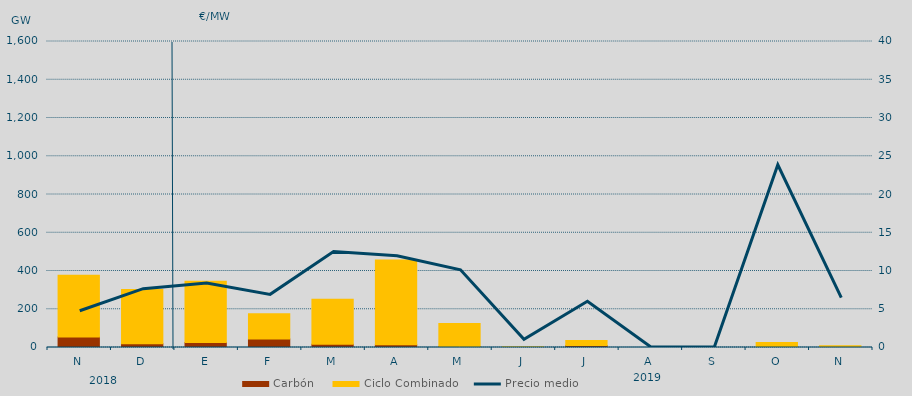
| Category | Carbón | Ciclo Combinado |
|---|---|---|
| N | 55331.6 | 322094.1 |
| D | 19590.2 | 283346.4 |
| E | 26403.5 | 320317.9 |
| F | 44880.1 | 131505 |
| M | 17298.8 | 234585 |
| A | 14816 | 442359.9 |
| M | 5017.5 | 120808.3 |
| J | 0 | 4200 |
| J | 10582.1 | 26246.2 |
| A | 0 | 0 |
| S | 0 | 0 |
| O | 0 | 25712.6 |
| N | 0 | 8552.1 |